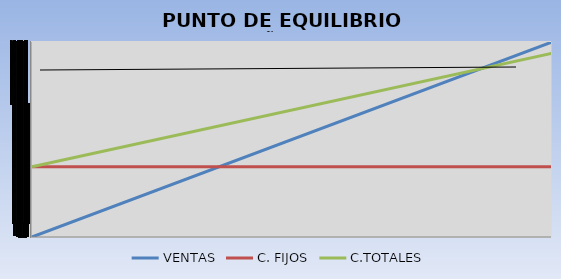
| Category | VENTAS | C. FIJOS | C.TOTALES |
|---|---|---|---|
| 0.0 | 0 | 53239521.437 | 53239521.437 |
| 333000.0 | 147605000 | 53239521.437 | 138998148.835 |